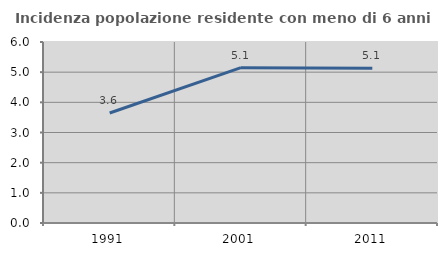
| Category | Incidenza popolazione residente con meno di 6 anni |
|---|---|
| 1991.0 | 3.646 |
| 2001.0 | 5.148 |
| 2011.0 | 5.129 |